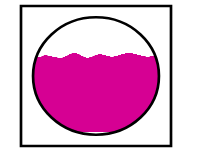
| Category | Series 0 | Series 1 | Series 2 |
|---|---|---|---|
| 0 | 0.63 | 0.05 | 0.32 |